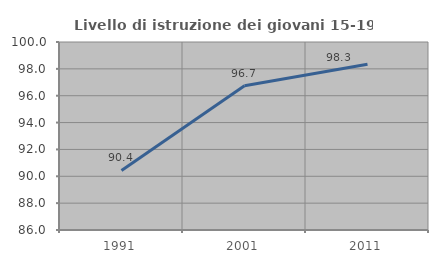
| Category | Livello di istruzione dei giovani 15-19 anni |
|---|---|
| 1991.0 | 90.435 |
| 2001.0 | 96.748 |
| 2011.0 | 98.347 |